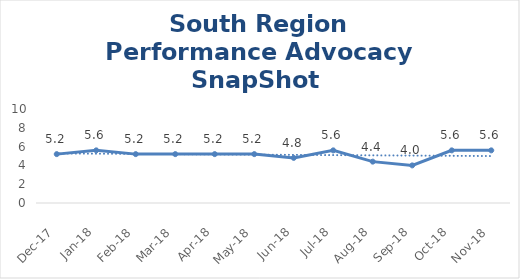
| Category | South Region |
|---|---|
| Dec-17 | 5.2 |
| Jan-18 | 5.6 |
| Feb-18 | 5.2 |
| Mar-18 | 5.2 |
| Apr-18 | 5.2 |
| May-18 | 5.2 |
| Jun-18 | 4.8 |
| Jul-18 | 5.6 |
| Aug-18 | 4.4 |
| Sep-18 | 4 |
| Oct-18 | 5.6 |
| Nov-18 | 5.6 |